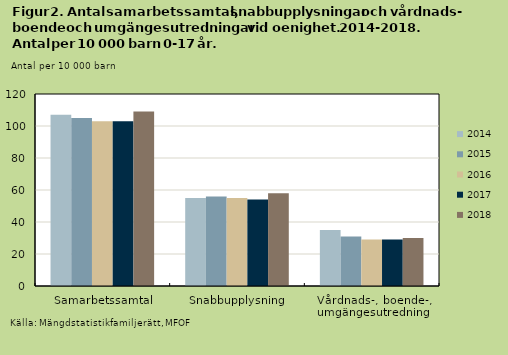
| Category | 2014 | 2015 | 2016 | 2017 | 2018 |
|---|---|---|---|---|---|
| Samarbetssamtal | 107 | 105 | 103 | 103 | 109 |
| Snabbupplysning | 55 | 56 | 55 | 54 | 58 |
| Vårdnads-, boende-, umgängesutredning | 35 | 31 | 29 | 29 | 30 |